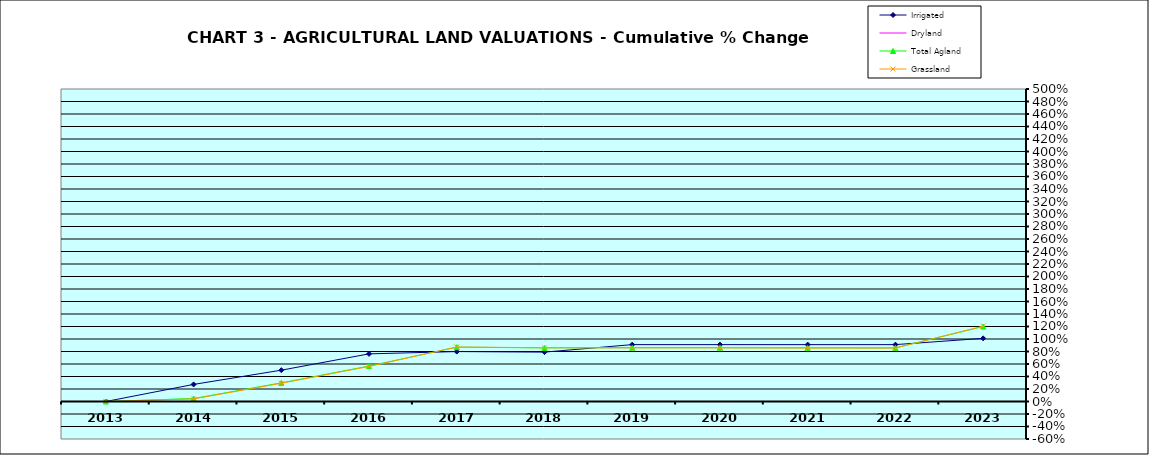
| Category | Irrigated | Dryland | Total Agland | Grassland |
|---|---|---|---|---|
| 2013.0 | 0 | 0 | 0 | 0 |
| 2014.0 | 0.273 | 0 | 0.048 | 0.041 |
| 2015.0 | 0.501 | 0 | 0.298 | 0.292 |
| 2016.0 | 0.762 | 0 | 0.567 | 0.561 |
| 2017.0 | 0.799 | 0 | 0.87 | 0.872 |
| 2018.0 | 0.79 | 0 | 0.858 | 0.86 |
| 2019.0 | 0.91 | 0 | 0.861 | 0.859 |
| 2020.0 | 0.91 | 0 | 0.861 | 0.859 |
| 2021.0 | 0.91 | 0 | 0.858 | 0.856 |
| 2022.0 | 0.91 | 0 | 0.858 | 0.856 |
| 2023.0 | 1.01 | 0 | 1.199 | 1.205 |